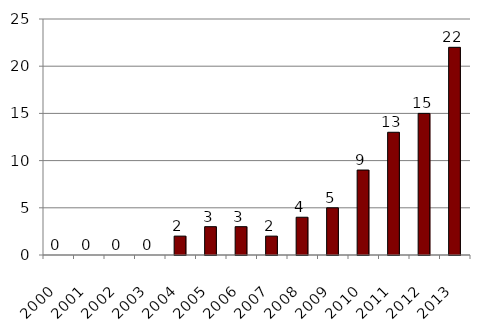
| Category | Generational |
|---|---|
| 2000.0 | 0 |
| 2001.0 | 0 |
| 2002.0 | 0 |
| 2003.0 | 0 |
| 2004.0 | 2 |
| 2005.0 | 3 |
| 2006.0 | 3 |
| 2007.0 | 2 |
| 2008.0 | 4 |
| 2009.0 | 5 |
| 2010.0 | 9 |
| 2011.0 | 13 |
| 2012.0 | 15 |
| 2013.0 | 22 |